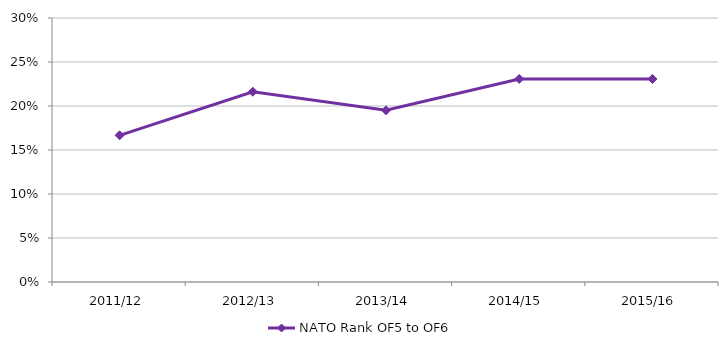
| Category | NATO Rank OF5 to OF6 |
|---|---|
| 2011/12 | 0.167 |
| 2012/13 | 0.216 |
| 2013/14 | 0.195 |
| 2014/15 | 0.231 |
| 2015/16 | 0.231 |